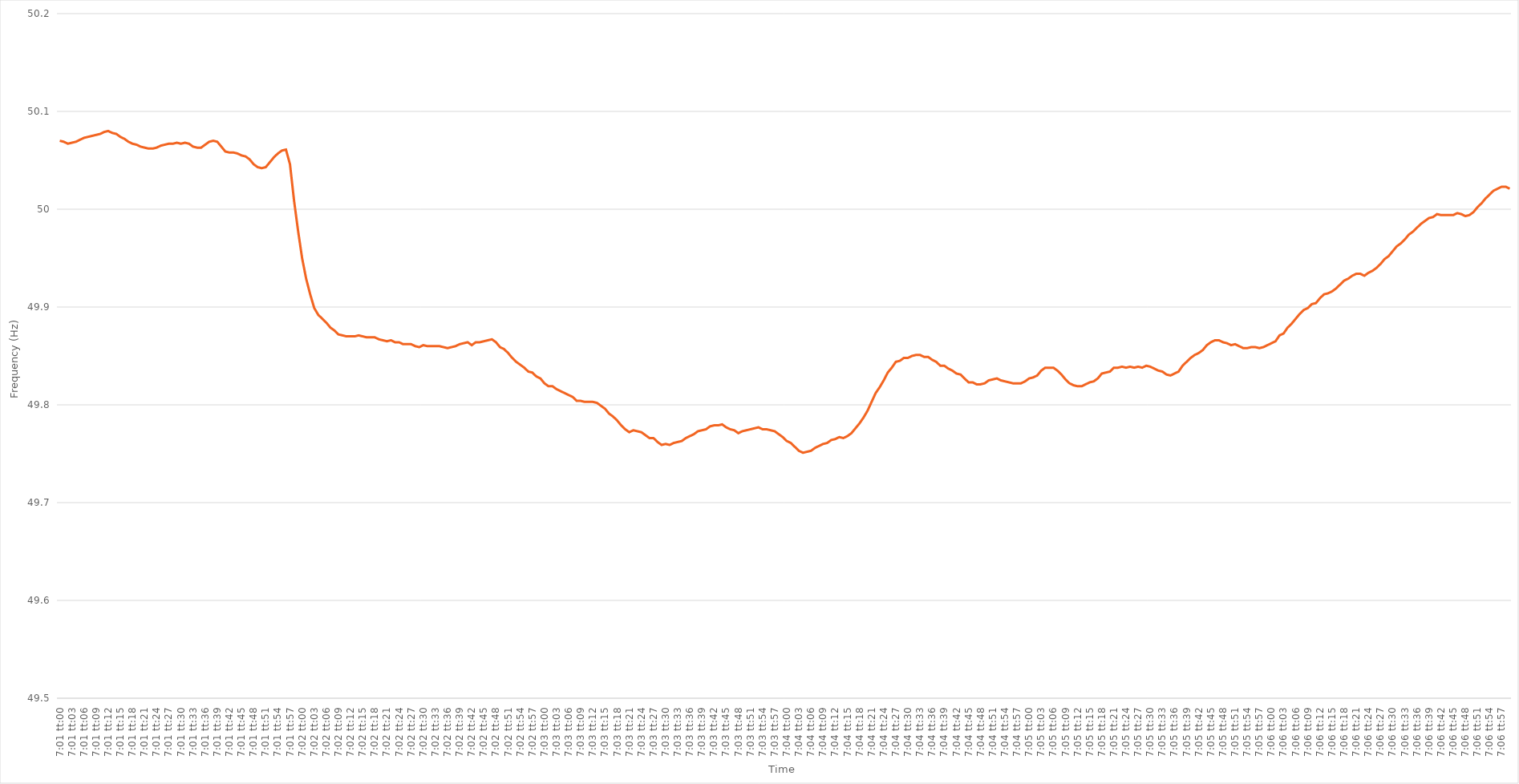
| Category | Series 0 |
|---|---|
| 0.2923611111111111 | 50.07 |
| 0.29237268518518517 | 50.069 |
| 0.29238425925925926 | 50.067 |
| 0.29239583333333335 | 50.068 |
| 0.2924074074074074 | 50.069 |
| 0.2924189814814815 | 50.071 |
| 0.2924305555555556 | 50.073 |
| 0.2924421296296296 | 50.074 |
| 0.2924537037037037 | 50.075 |
| 0.2924652777777778 | 50.076 |
| 0.29247685185185185 | 50.077 |
| 0.29248842592592594 | 50.079 |
| 0.2925 | 50.08 |
| 0.2925115740740741 | 50.078 |
| 0.2925231481481481 | 50.077 |
| 0.2925347222222222 | 50.074 |
| 0.2925462962962963 | 50.072 |
| 0.29255787037037034 | 50.069 |
| 0.29256944444444444 | 50.067 |
| 0.29258101851851853 | 50.066 |
| 0.29259259259259257 | 50.064 |
| 0.29260416666666667 | 50.063 |
| 0.29261574074074076 | 50.062 |
| 0.2926273148148148 | 50.062 |
| 0.2926388888888889 | 50.063 |
| 0.292650462962963 | 50.065 |
| 0.292662037037037 | 50.066 |
| 0.2926736111111111 | 50.067 |
| 0.2926851851851852 | 50.067 |
| 0.29269675925925925 | 50.068 |
| 0.29270833333333335 | 50.067 |
| 0.29271990740740744 | 50.068 |
| 0.2927314814814815 | 50.067 |
| 0.2927430555555555 | 50.064 |
| 0.2927546296296296 | 50.063 |
| 0.2927662037037037 | 50.063 |
| 0.29277777777777775 | 50.066 |
| 0.29278935185185184 | 50.069 |
| 0.29280092592592594 | 50.07 |
| 0.2928125 | 50.069 |
| 0.29282407407407407 | 50.064 |
| 0.29283564814814816 | 50.059 |
| 0.2928472222222222 | 50.058 |
| 0.2928587962962963 | 50.058 |
| 0.2928703703703704 | 50.057 |
| 0.29288194444444443 | 50.055 |
| 0.2928935185185185 | 50.054 |
| 0.2929050925925926 | 50.051 |
| 0.29291666666666666 | 50.046 |
| 0.29292824074074075 | 50.043 |
| 0.29293981481481485 | 50.042 |
| 0.2929513888888889 | 50.043 |
| 0.292962962962963 | 50.048 |
| 0.292974537037037 | 50.053 |
| 0.2929861111111111 | 50.057 |
| 0.29299768518518515 | 50.06 |
| 0.29300925925925925 | 50.061 |
| 0.29302083333333334 | 50.046 |
| 0.2930324074074074 | 50.009 |
| 0.2930439814814815 | 49.978 |
| 0.29305555555555557 | 49.95 |
| 0.2930671296296296 | 49.929 |
| 0.2930787037037037 | 49.913 |
| 0.2930902777777778 | 49.899 |
| 0.29310185185185184 | 49.892 |
| 0.29311342592592593 | 49.888 |
| 0.293125 | 49.884 |
| 0.29313657407407406 | 49.879 |
| 0.29314814814814816 | 49.876 |
| 0.29315972222222225 | 49.872 |
| 0.2931712962962963 | 49.871 |
| 0.2931828703703704 | 49.87 |
| 0.2931944444444445 | 49.87 |
| 0.2932060185185185 | 49.87 |
| 0.29321759259259256 | 49.871 |
| 0.29322916666666665 | 49.87 |
| 0.29324074074074075 | 49.869 |
| 0.2932523148148148 | 49.869 |
| 0.2932638888888889 | 49.869 |
| 0.293275462962963 | 49.867 |
| 0.293287037037037 | 49.866 |
| 0.2932986111111111 | 49.865 |
| 0.2933101851851852 | 49.866 |
| 0.29332175925925924 | 49.864 |
| 0.29333333333333333 | 49.864 |
| 0.29334490740740743 | 49.862 |
| 0.29335648148148147 | 49.862 |
| 0.29336805555555556 | 49.862 |
| 0.29337962962962966 | 49.86 |
| 0.2933912037037037 | 49.859 |
| 0.2934027777777778 | 49.861 |
| 0.2934143518518519 | 49.86 |
| 0.2934259259259259 | 49.86 |
| 0.2934375 | 49.86 |
| 0.29344907407407406 | 49.86 |
| 0.29346064814814815 | 49.859 |
| 0.2934722222222222 | 49.858 |
| 0.2934837962962963 | 49.859 |
| 0.2934953703703704 | 49.86 |
| 0.2935069444444444 | 49.862 |
| 0.2935185185185185 | 49.863 |
| 0.2935300925925926 | 49.864 |
| 0.29354166666666665 | 49.861 |
| 0.29355324074074074 | 49.864 |
| 0.29356481481481483 | 49.864 |
| 0.2935763888888889 | 49.865 |
| 0.29358796296296297 | 49.866 |
| 0.29359953703703706 | 49.867 |
| 0.2936111111111111 | 49.864 |
| 0.2936226851851852 | 49.859 |
| 0.2936342592592593 | 49.857 |
| 0.29364583333333333 | 49.853 |
| 0.2936574074074074 | 49.848 |
| 0.2936689814814815 | 49.844 |
| 0.29368055555555556 | 49.841 |
| 0.2936921296296296 | 49.838 |
| 0.2937037037037037 | 49.834 |
| 0.2937152777777778 | 49.833 |
| 0.2937268518518518 | 49.829 |
| 0.2937384259259259 | 49.827 |
| 0.29375 | 49.822 |
| 0.29376157407407405 | 49.819 |
| 0.29377314814814814 | 49.819 |
| 0.29378472222222224 | 49.816 |
| 0.2937962962962963 | 49.814 |
| 0.29380787037037037 | 49.812 |
| 0.29381944444444447 | 49.81 |
| 0.2938310185185185 | 49.808 |
| 0.2938425925925926 | 49.804 |
| 0.2938541666666667 | 49.804 |
| 0.29386574074074073 | 49.803 |
| 0.2938773148148148 | 49.803 |
| 0.2938888888888889 | 49.803 |
| 0.29390046296296296 | 49.802 |
| 0.29391203703703705 | 49.799 |
| 0.2939236111111111 | 49.796 |
| 0.2939351851851852 | 49.791 |
| 0.2939467592592592 | 49.788 |
| 0.2939583333333333 | 49.784 |
| 0.2939699074074074 | 49.779 |
| 0.29398148148148145 | 49.775 |
| 0.29399305555555555 | 49.772 |
| 0.29400462962962964 | 49.774 |
| 0.2940162037037037 | 49.773 |
| 0.2940277777777778 | 49.772 |
| 0.29403935185185187 | 49.769 |
| 0.2940509259259259 | 49.766 |
| 0.2940625 | 49.766 |
| 0.2940740740740741 | 49.762 |
| 0.29408564814814814 | 49.759 |
| 0.29409722222222223 | 49.76 |
| 0.2941087962962963 | 49.759 |
| 0.29412037037037037 | 49.761 |
| 0.29413194444444446 | 49.762 |
| 0.29414351851851855 | 49.763 |
| 0.2941550925925926 | 49.766 |
| 0.29416666666666663 | 49.768 |
| 0.2941782407407407 | 49.77 |
| 0.2941898148148148 | 49.773 |
| 0.29420138888888886 | 49.774 |
| 0.29421296296296295 | 49.775 |
| 0.29422453703703705 | 49.778 |
| 0.2942361111111111 | 49.779 |
| 0.2942476851851852 | 49.779 |
| 0.2942592592592593 | 49.78 |
| 0.2942708333333333 | 49.777 |
| 0.2942824074074074 | 49.775 |
| 0.2942939814814815 | 49.774 |
| 0.29430555555555554 | 49.771 |
| 0.29431712962962964 | 49.773 |
| 0.29432870370370373 | 49.774 |
| 0.29434027777777777 | 49.775 |
| 0.29435185185185186 | 49.776 |
| 0.29436342592592596 | 49.777 |
| 0.294375 | 49.775 |
| 0.2943865740740741 | 49.775 |
| 0.29439814814814813 | 49.774 |
| 0.2944097222222222 | 49.773 |
| 0.29442129629629626 | 49.77 |
| 0.29443287037037036 | 49.767 |
| 0.29444444444444445 | 49.763 |
| 0.2944560185185185 | 49.761 |
| 0.2944675925925926 | 49.757 |
| 0.2944791666666667 | 49.753 |
| 0.2944907407407407 | 49.751 |
| 0.2945023148148148 | 49.752 |
| 0.2945138888888889 | 49.753 |
| 0.29452546296296295 | 49.756 |
| 0.29453703703703704 | 49.758 |
| 0.29454861111111114 | 49.76 |
| 0.2945601851851852 | 49.761 |
| 0.29457175925925927 | 49.764 |
| 0.29458333333333336 | 49.765 |
| 0.2945949074074074 | 49.767 |
| 0.2946064814814815 | 49.766 |
| 0.2946180555555556 | 49.768 |
| 0.29462962962962963 | 49.771 |
| 0.29464120370370367 | 49.776 |
| 0.29465277777777776 | 49.781 |
| 0.29466435185185186 | 49.787 |
| 0.2946759259259259 | 49.794 |
| 0.2946875 | 49.803 |
| 0.2946990740740741 | 49.812 |
| 0.2947106481481481 | 49.818 |
| 0.2947222222222222 | 49.825 |
| 0.2947337962962963 | 49.833 |
| 0.29474537037037035 | 49.838 |
| 0.29475694444444445 | 49.844 |
| 0.29476851851851854 | 49.845 |
| 0.2947800925925926 | 49.848 |
| 0.2947916666666667 | 49.848 |
| 0.29480324074074077 | 49.85 |
| 0.2948148148148148 | 49.851 |
| 0.2948263888888889 | 49.851 |
| 0.294837962962963 | 49.849 |
| 0.29484953703703703 | 49.849 |
| 0.2948611111111111 | 49.846 |
| 0.29487268518518517 | 49.844 |
| 0.29488425925925926 | 49.84 |
| 0.2948958333333333 | 49.84 |
| 0.2949074074074074 | 49.837 |
| 0.2949189814814815 | 49.835 |
| 0.29493055555555553 | 49.832 |
| 0.2949421296296296 | 49.831 |
| 0.2949537037037037 | 49.827 |
| 0.29496527777777776 | 49.823 |
| 0.29497685185185185 | 49.823 |
| 0.29498842592592595 | 49.821 |
| 0.295 | 49.821 |
| 0.2950115740740741 | 49.822 |
| 0.2950231481481482 | 49.825 |
| 0.2950347222222222 | 49.826 |
| 0.2950462962962963 | 49.827 |
| 0.2950578703703704 | 49.825 |
| 0.29506944444444444 | 49.824 |
| 0.29508101851851853 | 49.823 |
| 0.29509259259259263 | 49.822 |
| 0.29510416666666667 | 49.822 |
| 0.2951157407407407 | 49.822 |
| 0.2951273148148148 | 49.824 |
| 0.2951388888888889 | 49.827 |
| 0.29515046296296293 | 49.828 |
| 0.29516203703703703 | 49.83 |
| 0.2951736111111111 | 49.835 |
| 0.29518518518518516 | 49.838 |
| 0.29519675925925926 | 49.838 |
| 0.29520833333333335 | 49.838 |
| 0.2952199074074074 | 49.835 |
| 0.2952314814814815 | 49.831 |
| 0.2952430555555556 | 49.826 |
| 0.2952546296296296 | 49.822 |
| 0.2952662037037037 | 49.82 |
| 0.2952777777777778 | 49.819 |
| 0.29528935185185184 | 49.819 |
| 0.29530092592592594 | 49.821 |
| 0.29531250000000003 | 49.823 |
| 0.29532407407407407 | 49.824 |
| 0.29533564814814817 | 49.827 |
| 0.2953472222222222 | 49.832 |
| 0.2953587962962963 | 49.833 |
| 0.29537037037037034 | 49.834 |
| 0.29538194444444443 | 49.838 |
| 0.2953935185185185 | 49.838 |
| 0.29540509259259257 | 49.839 |
| 0.29541666666666666 | 49.838 |
| 0.29542824074074076 | 49.839 |
| 0.2954398148148148 | 49.838 |
| 0.2954513888888889 | 49.839 |
| 0.295462962962963 | 49.838 |
| 0.295474537037037 | 49.84 |
| 0.2954861111111111 | 49.839 |
| 0.2954976851851852 | 49.837 |
| 0.29550925925925925 | 49.835 |
| 0.29552083333333334 | 49.834 |
| 0.29553240740740744 | 49.831 |
| 0.2955439814814815 | 49.83 |
| 0.29555555555555557 | 49.832 |
| 0.29556712962962967 | 49.834 |
| 0.2955787037037037 | 49.84 |
| 0.29559027777777774 | 49.844 |
| 0.29560185185185184 | 49.848 |
| 0.29561342592592593 | 49.851 |
| 0.29562499999999997 | 49.853 |
| 0.29563657407407407 | 49.856 |
| 0.29564814814814816 | 49.861 |
| 0.2956597222222222 | 49.864 |
| 0.2956712962962963 | 49.866 |
| 0.2956828703703704 | 49.866 |
| 0.2956944444444444 | 49.864 |
| 0.2957060185185185 | 49.863 |
| 0.2957175925925926 | 49.861 |
| 0.29572916666666665 | 49.862 |
| 0.29574074074074075 | 49.86 |
| 0.29575231481481484 | 49.858 |
| 0.2957638888888889 | 49.858 |
| 0.295775462962963 | 49.859 |
| 0.29578703703703707 | 49.859 |
| 0.2957986111111111 | 49.858 |
| 0.29581018518518515 | 49.859 |
| 0.29582175925925924 | 49.861 |
| 0.29583333333333334 | 49.863 |
| 0.2958449074074074 | 49.865 |
| 0.29585648148148147 | 49.871 |
| 0.29586805555555556 | 49.873 |
| 0.2958796296296296 | 49.879 |
| 0.2958912037037037 | 49.883 |
| 0.2959027777777778 | 49.888 |
| 0.29591435185185183 | 49.893 |
| 0.2959259259259259 | 49.897 |
| 0.2959375 | 49.899 |
| 0.29594907407407406 | 49.903 |
| 0.29596064814814815 | 49.904 |
| 0.29597222222222225 | 49.909 |
| 0.2959837962962963 | 49.913 |
| 0.2959953703703704 | 49.914 |
| 0.2960069444444445 | 49.916 |
| 0.2960185185185185 | 49.919 |
| 0.2960300925925926 | 49.923 |
| 0.2960416666666667 | 49.927 |
| 0.29605324074074074 | 49.929 |
| 0.2960648148148148 | 49.932 |
| 0.2960763888888889 | 49.934 |
| 0.29608796296296297 | 49.934 |
| 0.296099537037037 | 49.932 |
| 0.2961111111111111 | 49.935 |
| 0.2961226851851852 | 49.937 |
| 0.29613425925925924 | 49.94 |
| 0.29614583333333333 | 49.944 |
| 0.2961574074074074 | 49.949 |
| 0.29616898148148146 | 49.952 |
| 0.29618055555555556 | 49.957 |
| 0.29619212962962965 | 49.962 |
| 0.2962037037037037 | 49.965 |
| 0.2962152777777778 | 49.969 |
| 0.2962268518518519 | 49.974 |
| 0.2962384259259259 | 49.977 |
| 0.29625 | 49.981 |
| 0.2962615740740741 | 49.985 |
| 0.29627314814814815 | 49.988 |
| 0.29628472222222224 | 49.991 |
| 0.2962962962962963 | 49.992 |
| 0.2963078703703704 | 49.995 |
| 0.2963194444444444 | 49.994 |
| 0.2963310185185185 | 49.994 |
| 0.2963425925925926 | 49.994 |
| 0.29635416666666664 | 49.994 |
| 0.29636574074074074 | 49.996 |
| 0.29637731481481483 | 49.995 |
| 0.29638888888888887 | 49.993 |
| 0.29640046296296296 | 49.994 |
| 0.29641203703703706 | 49.997 |
| 0.2964236111111111 | 50.002 |
| 0.2964351851851852 | 50.006 |
| 0.2964467592592593 | 50.011 |
| 0.2964583333333333 | 50.015 |
| 0.2964699074074074 | 50.019 |
| 0.2964814814814815 | 50.021 |
| 0.29649305555555555 | 50.023 |
| 0.29650462962962965 | 50.023 |
| 0.29651620370370374 | 50.021 |